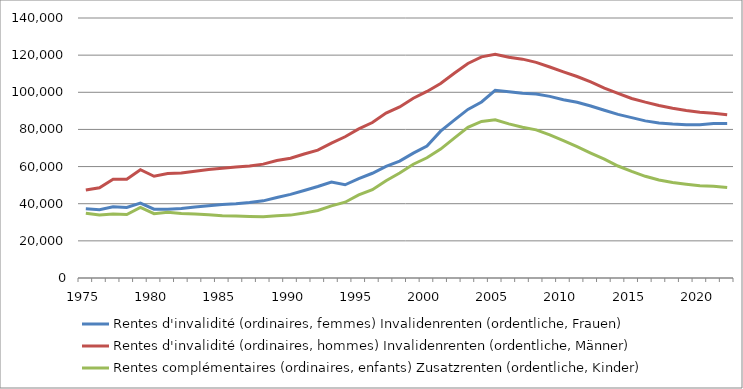
| Category | Rentes d'invalidité (ordinaires, femmes) | Rentes d'invalidité (ordinaires, hommes) | Rentes complémentaires (ordinaires, enfants) |
|---|---|---|---|
| 1975.0 | 37264 | 47417 | 34841 |
| 1976.0 | 36808 | 48609 | 33885 |
| 1977.0 | 38411 | 53229 | 34463 |
| 1978.0 | 38001 | 53203 | 34207 |
| 1979.0 | 40285 | 58288 | 37966 |
| 1980.0 | 37023 | 54774 | 34623 |
| 1981.0 | 36994 | 56251 | 35432 |
| 1982.0 | 37457 | 56509 | 34731 |
| 1983.0 | 38286 | 57515 | 34523 |
| 1984.0 | 38910 | 58467 | 34110 |
| 1985.0 | 39589 | 59052 | 33534 |
| 1986.0 | 39994 | 59741 | 33443 |
| 1987.0 | 40639 | 60356 | 33147 |
| 1988.0 | 41538 | 61310 | 33010 |
| 1989.0 | 43381 | 63242 | 33505 |
| 1990.0 | 45029 | 64480 | 33858 |
| 1991.0 | 47138 | 66756 | 34944 |
| 1992.0 | 49292 | 68850 | 36385 |
| 1993.0 | 51705 | 72660 | 38835 |
| 1994.0 | 50205 | 76059 | 40808 |
| 1995.0 | 53536 | 80288 | 44723 |
| 1996.0 | 56398 | 83703 | 47552 |
| 1997.0 | 60114 | 88786 | 52357 |
| 1998.0 | 62962 | 92094 | 56527 |
| 1999.0 | 67262 | 96795 | 61245 |
| 2000.0 | 71034 | 100460 | 64730 |
| 2001.0 | 79061 | 104759 | 69434 |
| 2002.0 | 85045 | 110274 | 75282 |
| 2003.0 | 90784 | 115512 | 81116 |
| 2004.0 | 94789 | 119097 | 84297 |
| 2005.0 | 101035 | 120488 | 85234 |
| 2006.0 | 100287 | 118888 | 82977 |
| 2007.0 | 99537 | 117835 | 81207 |
| 2008.0 | 99037 | 116115 | 79750 |
| 2009.0 | 97796 | 113594 | 77027 |
| 2010.0 | 96013 | 110952 | 73982 |
| 2011.0 | 94590 | 108489 | 70746 |
| 2012.0 | 92640 | 105562 | 67293 |
| 2013.0 | 90332 | 102280 | 63993 |
| 2014.0 | 88081 | 99415 | 60297 |
| 2015.0 | 86359 | 96681 | 57432 |
| 2016.0 | 84595 | 94679 | 54759 |
| 2017.0 | 83423 | 92871 | 52737 |
| 2018.0 | 82873 | 91424 | 51437 |
| 2019.0 | 82573 | 90225 | 50500 |
| 2020.0 | 82508 | 89288 | 49666 |
| 2021.0 | 83197 | 88742 | 49450 |
| 2022.0 | 83235 | 87962 | 48760 |